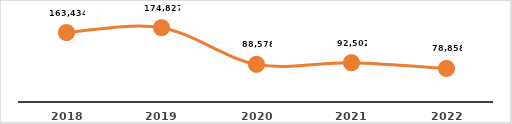
| Category | CERTIFICACIÓN DE COMPETENCIAS (%) |
|---|---|
| 2018.0 | 163434 |
| 2019.0 | 174827 |
| 2020.0 | 88578 |
| 2021.0 | 92502 |
| 2022.0 | 78858 |